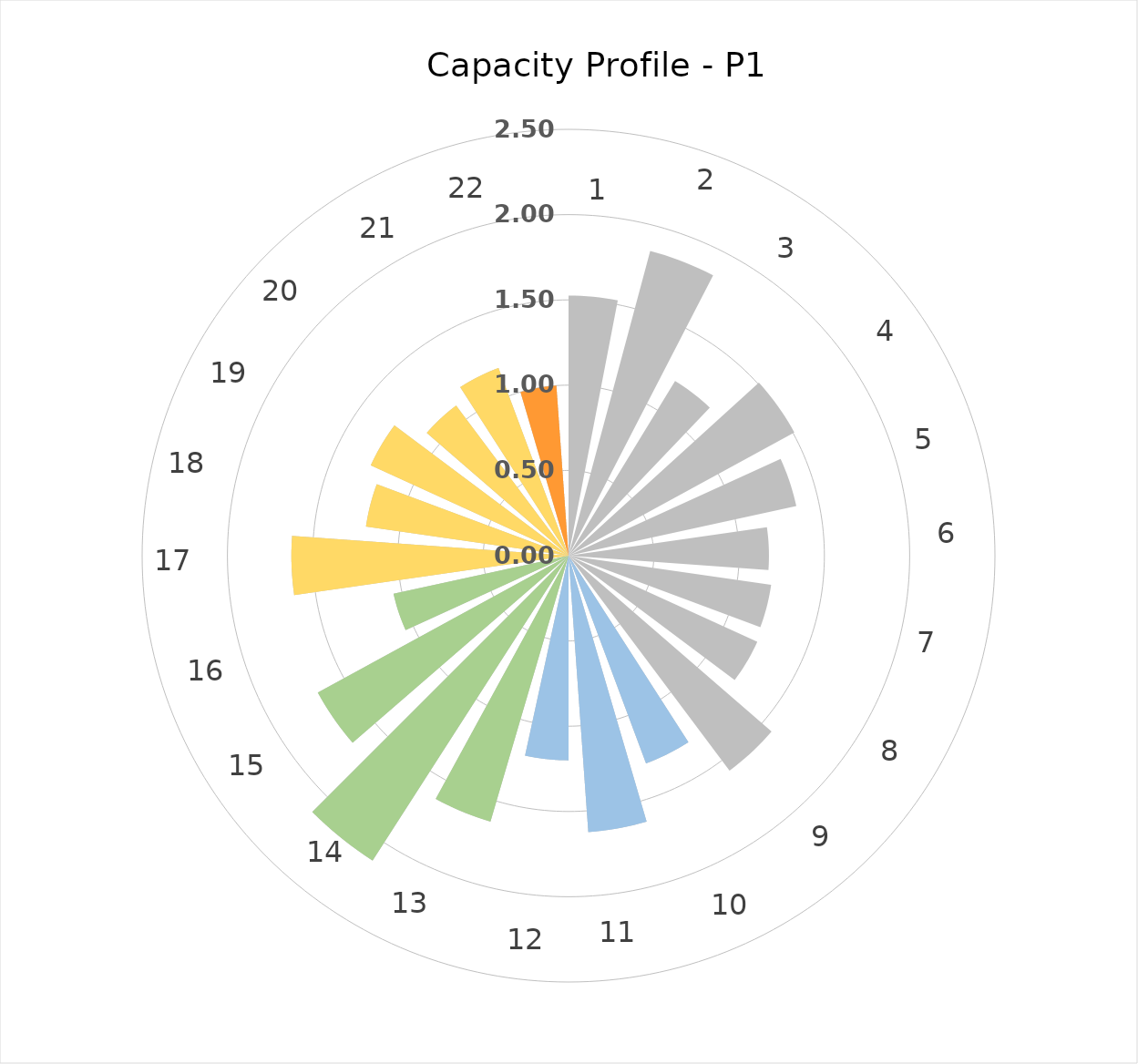
| Category | Label |
|---|---|
| 1.1 | 2 |
| 1.2 | 2 |
| 1.3 | 2 |
| 1.4 | 2 |
| 1.5 | 2 |
| 1.6 | 2 |
| 1.7 | 2 |
| 1.8 | 2 |
| 1.9 | 2 |
| 2.1 | 2 |
| 2.2 | 2 |
| 2.3 | 2 |
| 3.1 | 2 |
| 3.2 | 2 |
| 3.3 | 2 |
| 3.4 | 2 |
| 4.1 | 2 |
| 4.2 | 2 |
| 4.3 | 2 |
| 4.4 | 2 |
| 4.5 | 2 |
| 5.1 | 2 |